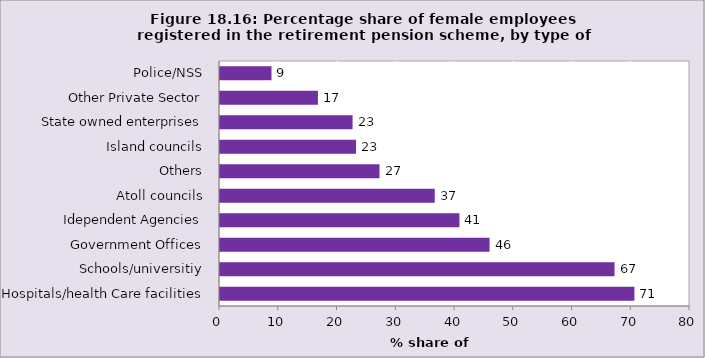
| Category | Series 0 |
|---|---|
| Hospitals/health Care facilities | 70.541 |
| Schools/universitiy | 67.151 |
| Government Offices | 45.886 |
| Idependent Agencies | 40.756 |
| Atoll councils | 36.552 |
| Others | 27.152 |
| Island councils | 23.159 |
| State owned enterprises | 22.567 |
| Other Private Sector | 16.669 |
| Police/NSS | 8.766 |